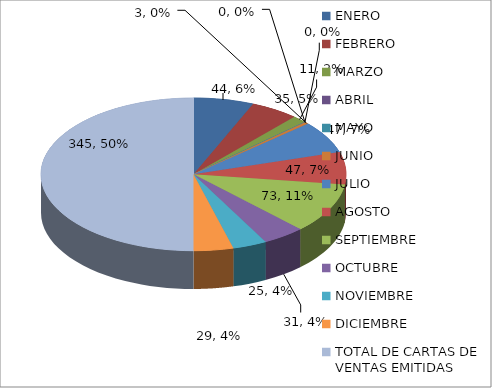
| Category | Series 0 |
|---|---|
| ENERO | 44 |
| FEBRERO | 35 |
| MARZO | 11 |
| ABRIL | 0 |
| MAYO | 0 |
| JUNIO | 3 |
| JULIO | 47 |
| AGOSTO | 47 |
| SEPTIEMBRE | 73 |
| OCTUBRE | 31 |
| NOVIEMBRE | 25 |
| DICIEMBRE | 29 |
| TOTAL DE CARTAS DE VENTAS EMITIDAS   | 345 |